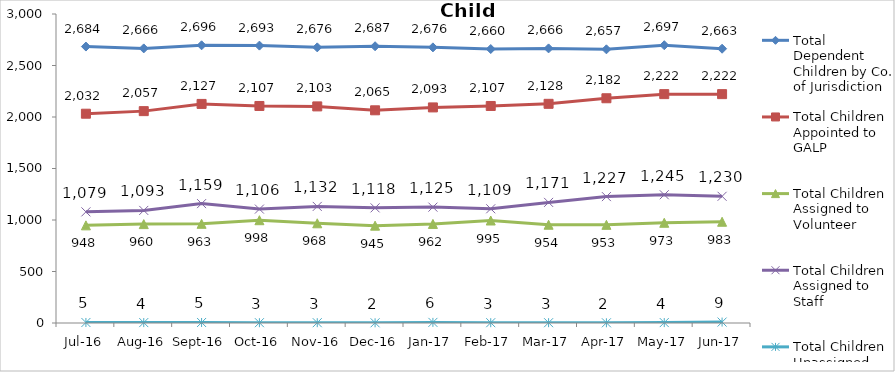
| Category | Total Dependent Children by Co. of Jurisdiction | Total Children Appointed to GALP | Total Children Assigned to Volunteer | Total Children Assigned to Staff | Total Children Unassigned |
|---|---|---|---|---|---|
| Jul-16 | 2684 | 2032 | 948 | 1079 | 5 |
| Aug-16 | 2666 | 2057 | 960 | 1093 | 4 |
| Sep-16 | 2696 | 2127 | 963 | 1159 | 5 |
| Oct-16 | 2693 | 2107 | 998 | 1106 | 3 |
| Nov-16 | 2676 | 2103 | 968 | 1132 | 3 |
| Dec-16 | 2687 | 2065 | 945 | 1118 | 2 |
| Jan-17 | 2676 | 2093 | 962 | 1125 | 6 |
| Feb-17 | 2660 | 2107 | 995 | 1109 | 3 |
| Mar-17 | 2666 | 2128 | 954 | 1171 | 3 |
| Apr-17 | 2657 | 2182 | 953 | 1227 | 2 |
| May-17 | 2697 | 2222 | 973 | 1245 | 4 |
| Jun-17 | 2663 | 2222 | 983 | 1230 | 9 |